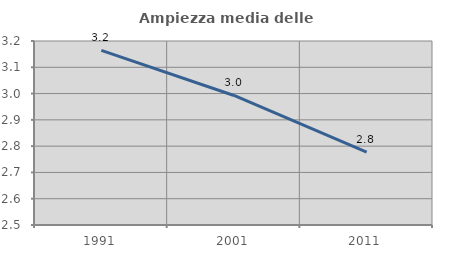
| Category | Ampiezza media delle famiglie |
|---|---|
| 1991.0 | 3.164 |
| 2001.0 | 2.993 |
| 2011.0 | 2.777 |